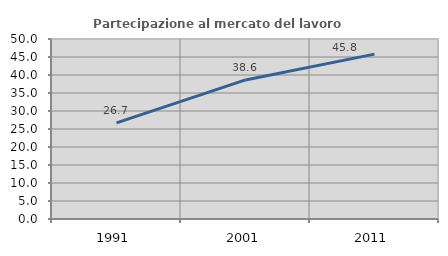
| Category | Partecipazione al mercato del lavoro  femminile |
|---|---|
| 1991.0 | 26.685 |
| 2001.0 | 38.626 |
| 2011.0 | 45.792 |